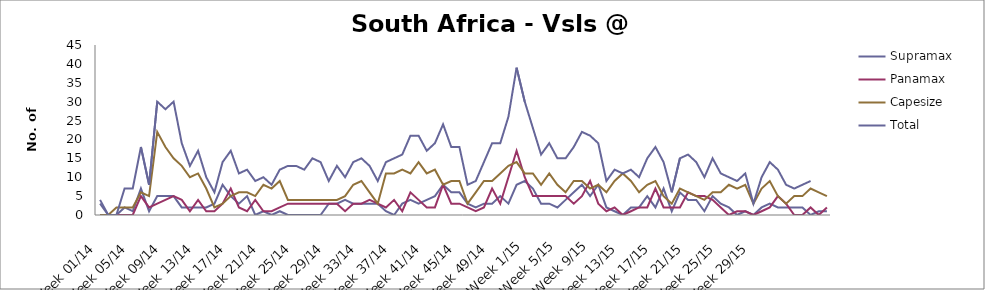
| Category | Supramax | Panamax | Capesize | Total |
|---|---|---|---|---|
| Week 01/14 | 3 | 0 | 0 | 4 |
| Week 02/14 | 0 | 0 | 0 | 0 |
| Week 03/14 | 0 | 0 | 2 | 0 |
| Week 04/14 | 2 | 0 | 2 | 7 |
| Week 05/14 | 1 | 0 | 2 | 7 |
| Week 06/14 | 7 | 5 | 6 | 18 |
| Week 07/14 | 1 | 2 | 5 | 8 |
| Week 08/14 | 5 | 3 | 22 | 30 |
| Week 09/14 | 5 | 4 | 18 | 28 |
| Week 10/14 | 5 | 5 | 15 | 30 |
| Week 11/14 | 2 | 4 | 13 | 19 |
| Week 12/14 | 2 | 1 | 10 | 13 |
| Week 13/14 | 2 | 4 | 11 | 17 |
| Week 14/14 | 2 | 1 | 7 | 10 |
| Week 15/14 | 3 | 1 | 2 | 6 |
| Week 16/14 | 8 | 3 | 3 | 14 |
| Week 17/14 | 5 | 7 | 5 | 17 |
| Week 18/14 | 3 | 2 | 6 | 11 |
| Week 19/14 | 5 | 1 | 6 | 12 |
| Week 20/14 | 0 | 4 | 5 | 9 |
| Week 21/14 | 1 | 1 | 8 | 10 |
| Week 22/14 | 0 | 1 | 7 | 8 |
| Week 23/14 | 1 | 2 | 9 | 12 |
| Week 24/14 | 0 | 3 | 4 | 13 |
| Week 25/14 | 0 | 3 | 4 | 13 |
| Week 26/14 | 0 | 3 | 4 | 12 |
| Week 27/14 | 0 | 3 | 4 | 15 |
| Week 28/14 | 0 | 3 | 4 | 14 |
| Week 29/14 | 3 | 3 | 4 | 9 |
| Week 30/14 | 3 | 3 | 4 | 13 |
| Week 31/14 | 4 | 1 | 5 | 10 |
| Week 32/14 | 3 | 3 | 8 | 14 |
| Week 33/14 | 3 | 3 | 9 | 15 |
| Week 34/14 | 3 | 4 | 6 | 13 |
| Week 35/14 | 3 | 3 | 3 | 9 |
| Week 36/14 | 1 | 2 | 11 | 14 |
| Week 37/14 | 0 | 4 | 11 | 15 |
| Week 38/14 | 3 | 1 | 12 | 16 |
| Week 39/14 | 4 | 6 | 11 | 21 |
| Week 40/14 | 3 | 4 | 14 | 21 |
| Week 41/14 | 4 | 2 | 11 | 17 |
| Week 42/14 | 5 | 2 | 12 | 19 |
| Week 43/14 | 8 | 8 | 8 | 24 |
| Week 44/14 | 6 | 3 | 9 | 18 |
| Week 45/14 | 6 | 3 | 9 | 18 |
| Week 46/14 | 3 | 2 | 3 | 8 |
| Week 47/14 | 2 | 1 | 6 | 9 |
| Week 48/14 | 3 | 2 | 9 | 14 |
| Week 49/14 | 3 | 7 | 9 | 19 |
| Week 50/14 | 5 | 3 | 11 | 19 |
| Week 51/14 | 3 | 10 | 13 | 26 |
| Week 52/14 | 8 | 17 | 14 | 39 |
| Week 1/15 | 9 | 10 | 11 | 30 |
| Week 2/15 | 7 | 5 | 11 | 23 |
| Week 3/15 | 3 | 5 | 8 | 16 |
| Week 4/15 | 3 | 5 | 11 | 19 |
| Week 5/15 | 2 | 5 | 8 | 15 |
| Week 6/15 | 4 | 5 | 6 | 15 |
| Week 7/15 | 6 | 3 | 9 | 18 |
| Week 8/15 | 8 | 5 | 9 | 22 |
| Week 9/15 | 5 | 9 | 7 | 21 |
| Week 10/15 | 8 | 3 | 8 | 19 |
| Week 11/15 | 2 | 1 | 6 | 9 |
| Week 12/15 | 1 | 2 | 9 | 12 |
| Week 13/15 | 0 | 0 | 11 | 11 |
| Week 14/15 | 2 | 1 | 9 | 12 |
| Week 15/15 | 2 | 2 | 6 | 10 |
| Week 16/15 | 5 | 2 | 8 | 15 |
| Week 17/15 | 2 | 7 | 9 | 18 |
| Week 18/15 | 7 | 2 | 5 | 14 |
| Week 19/15 | 1 | 2 | 3 | 6 |
| Week 20/15 | 6 | 2 | 7 | 15 |
| Week 21/15 | 4 | 6 | 6 | 16 |
| Week 22/15 | 4 | 5 | 5 | 14 |
| Week 23/15 | 1 | 5 | 4 | 10 |
| Week 24/15 | 5 | 4 | 6 | 15 |
| Week 25/15 | 3 | 2 | 6 | 11 |
| Week 26/15 | 2 | 0 | 8 | 10 |
| Week 27/15 | 0 | 1 | 7 | 9 |
| Week 28/15 | 1 | 1 | 8 | 11 |
| Week 29/15 | 0 | 0 | 3 | 3 |
| Week 30/15 | 2 | 1 | 7 | 10 |
| Week 31/15 | 3 | 2 | 9 | 14 |